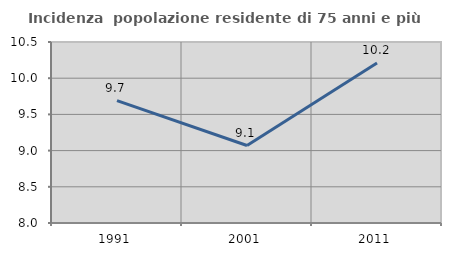
| Category | Incidenza  popolazione residente di 75 anni e più |
|---|---|
| 1991.0 | 9.69 |
| 2001.0 | 9.07 |
| 2011.0 | 10.211 |